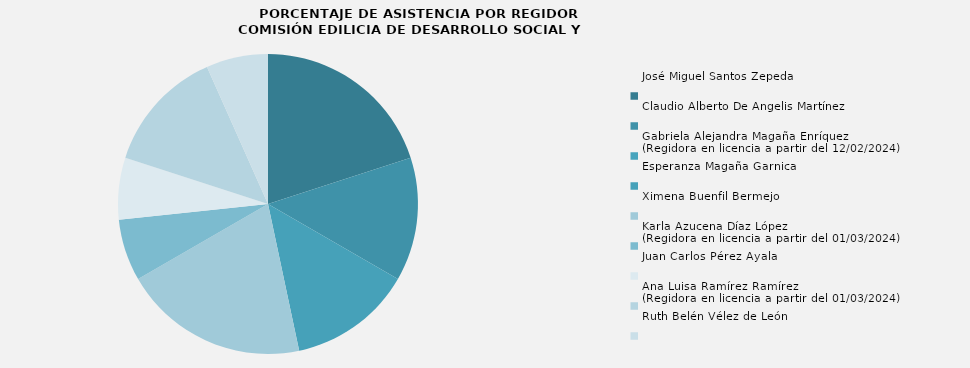
| Category | José Miguel Santos Zepeda  |
|---|---|
| José Miguel Santos Zepeda  | 100 |
| Claudio Alberto De Angelis Martínez | 66.667 |
| Gabriela Alejandra Magaña Enríquez
(Regidora en licencia a partir del 12/02/2024) | 0 |
| Esperanza Magaña Garnica | 66.667 |
| Ximena Buenfil Bermejo | 100 |
| Karla Azucena Díaz López
(Regidora en licencia a partir del 01/03/2024) | 33.333 |
| Juan Carlos Pérez Ayala  | 33.333 |
| Ana Luisa Ramírez Ramírez
(Regidora en licencia a partir del 01/03/2024) | 66.667 |
| Ruth Belén Vélez de León | 33.333 |